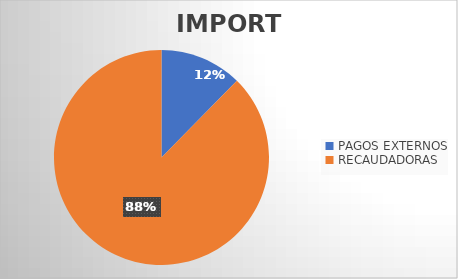
| Category | IMPORTE |
|---|---|
| PAGOS EXTERNOS | 26965743.6 |
| RECAUDADORAS | 191106742.51 |